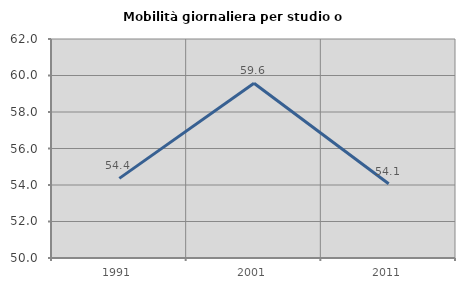
| Category | Mobilità giornaliera per studio o lavoro |
|---|---|
| 1991.0 | 54.362 |
| 2001.0 | 59.574 |
| 2011.0 | 54.067 |